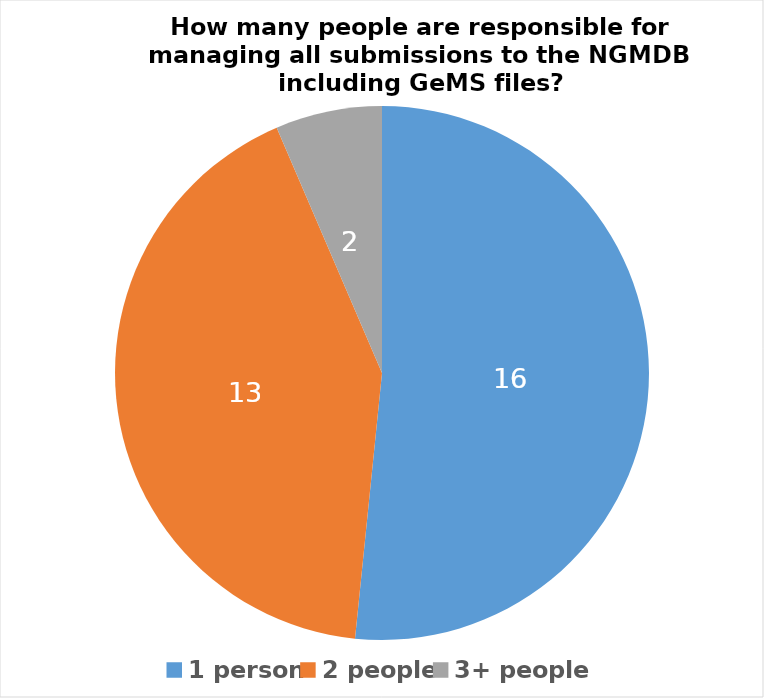
| Category | Series 0 |
|---|---|
| 1 person | 16 |
| 2 people | 13 |
| 3+ people | 2 |